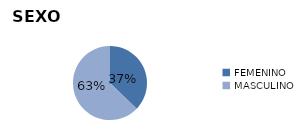
| Category | Series 0 |
|---|---|
| FEMENINO | 1042 |
| MASCULINO | 1760 |